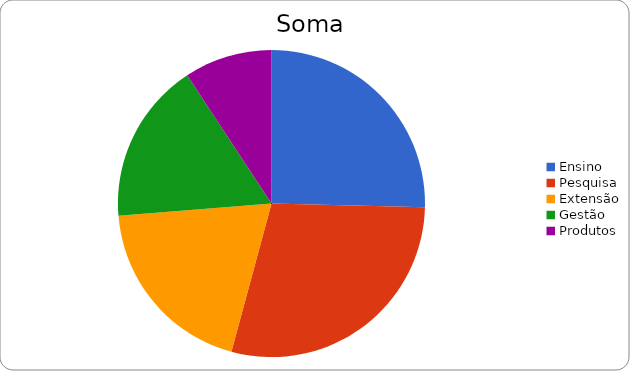
| Category | Informática e Comunicação |
|---|---|
| Ensino | 213.99 |
| Pesquisa | 243 |
| Extensão | 164.5 |
| Gestão | 143.5 |
| Produtos | 78 |